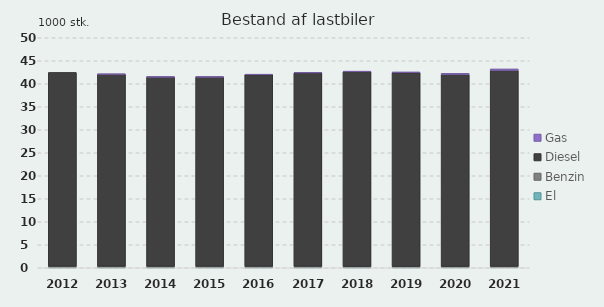
| Category | El | Benzin | Diesel | Gas |
|---|---|---|---|---|
| 2012 | 0.01 | 0.32 | 42.14 | 0 |
| 2013 | 0.01 | 0.32 | 41.75 | 0.01 |
| 2014 | 0.01 | 0.31 | 41.16 | 0.02 |
| 2015 | 0.01 | 0.3 | 41.17 | 0.05 |
| 2016 | 0.01 | 0.29 | 41.67 | 0.1 |
| 2017 | 0.01 | 0.29 | 42.07 | 0.13 |
| 2018 | 0.01 | 0.28 | 42.31 | 0.15 |
| 2019 | 0.01 | 0.27 | 42.11 | 0.19 |
| 2020 | 0.03 | 0.25 | 41.75 | 0.23 |
| 2021 | 0.06 | 0.25 | 42.59 | 0.33 |